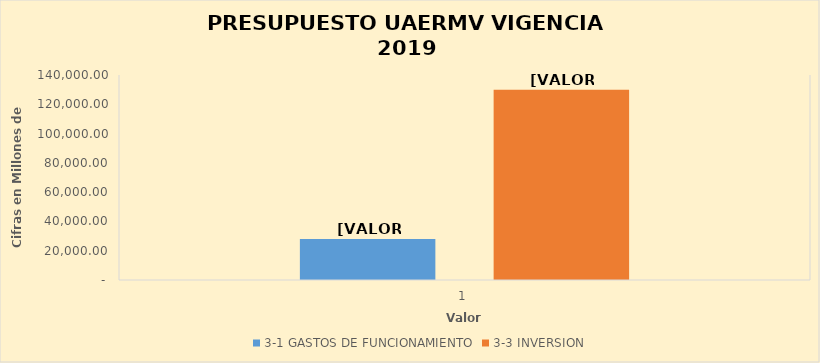
| Category | 3-1 | 3-3 |
|---|---|---|
| 0 | 28072.61 | 129977.394 |